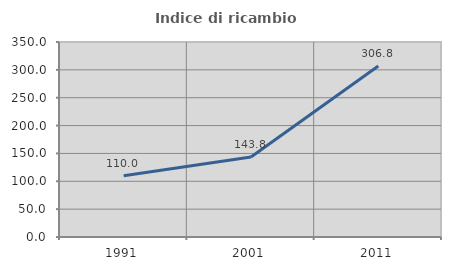
| Category | Indice di ricambio occupazionale  |
|---|---|
| 1991.0 | 109.983 |
| 2001.0 | 143.75 |
| 2011.0 | 306.849 |